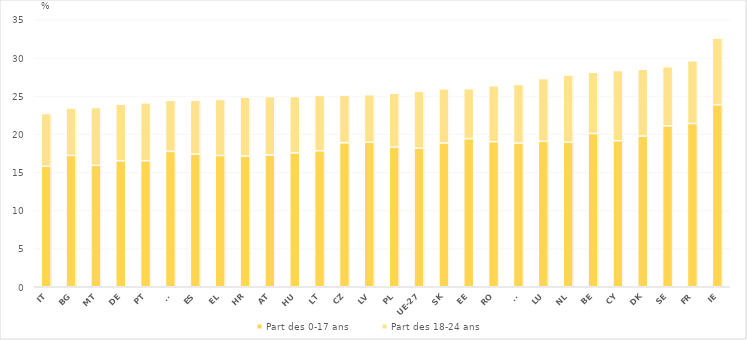
| Category | Part des 0-17 ans | Part des 18-24 ans |
|---|---|---|
| IT | 15.786 | 6.921 |
| BG | 17.213 | 6.204 |
| MT | 15.914 | 7.581 |
| DE | 16.528 | 7.409 |
| PT | 16.524 | 7.586 |
| SI | 17.744 | 6.692 |
| ES | 17.389 | 7.064 |
| EL | 17.202 | 7.352 |
| HR | 17.14 | 7.727 |
| AT | 17.284 | 7.653 |
| HU | 17.539 | 7.408 |
| LT | 17.825 | 7.257 |
| CZ | 18.862 | 6.256 |
| LV | 18.938 | 6.238 |
| PL | 18.294 | 7.058 |
| UE-27 | 18.153 | 7.468 |
| SK | 18.832 | 7.116 |
| EE | 19.415 | 6.546 |
| RO | 19.016 | 7.332 |
| FI | 18.821 | 7.698 |
| LU | 19.062 | 8.222 |
| NL | 18.948 | 8.811 |
| BE | 20.089 | 8.036 |
| CY | 19.138 | 9.202 |
| DK | 19.743 | 8.787 |
| SE | 21.094 | 7.75 |
| FR | 21.398 | 8.228 |
| IE | 23.866 | 8.73 |